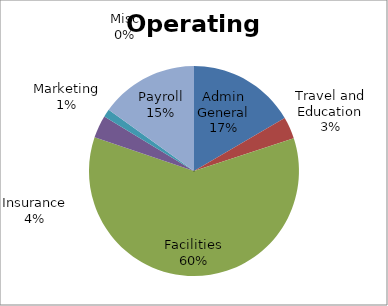
| Category | Series 0 |
|---|---|
| Admin General | 1727.41 |
| Travel and Education | 350 |
| Facilities | 6270.51 |
| Insurance | 364.25 |
| Marketing | 125.62 |
| Misc | 0 |
| Payroll | 1571.31 |